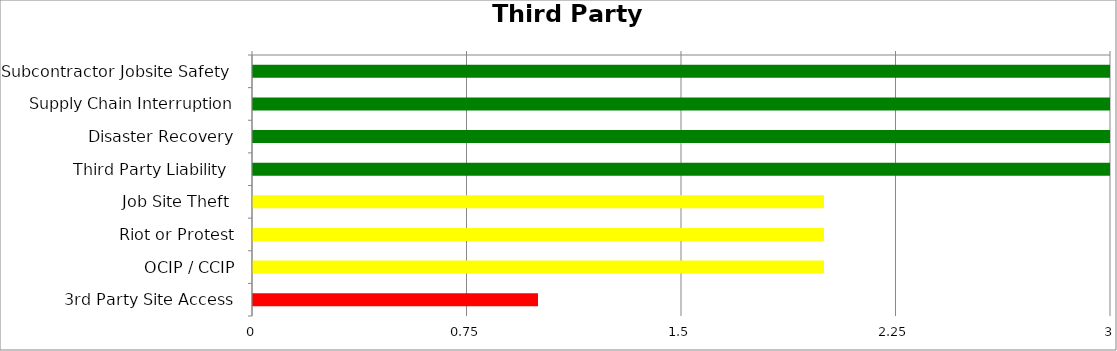
| Category | Low | Medium | High |
|---|---|---|---|
| Subcontractor Jobsite Safety  | 3 | 0 | 0 |
| Supply Chain Interruption | 3 | 0 | 0 |
| Disaster Recovery | 3 | 0 | 0 |
| Third Party Liability  | 3 | 0 | 0 |
| Job Site Theft  | 0 | 2 | 0 |
| Riot or Protest | 0 | 2 | 0 |
| OCIP / CCIP | 0 | 2 | 0 |
| 3rd Party Site Access | 0 | 0 | 1 |